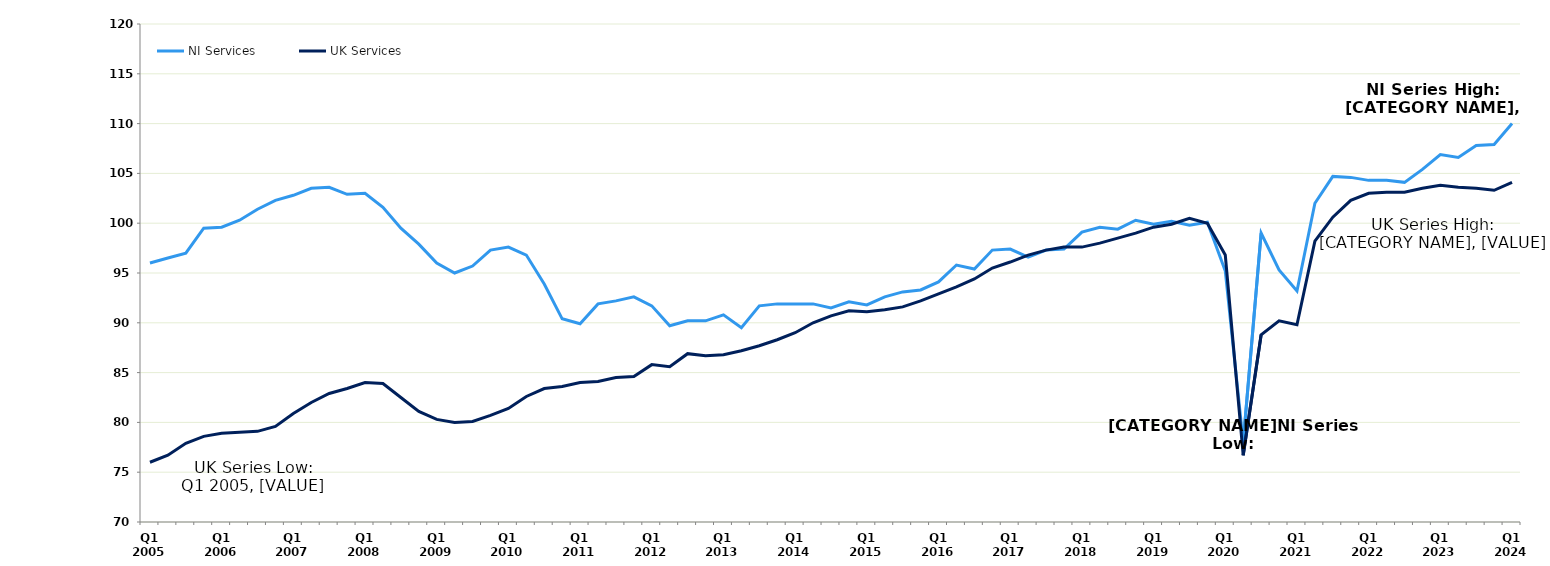
| Category | NI Services | UK Services |
|---|---|---|
| Q1 2005 | 96 | 76 |
|  | 96.5 | 76.7 |
|  | 97 | 77.9 |
|  | 99.5 | 78.6 |
| Q1 2006 | 99.6 | 78.9 |
|  | 100.3 | 79 |
|  | 101.4 | 79.1 |
|  | 102.3 | 79.6 |
| Q1 2007 | 102.8 | 80.9 |
|  | 103.5 | 82 |
|  | 103.6 | 82.9 |
|  | 102.9 | 83.4 |
| Q1 2008 | 103 | 84 |
|  | 101.6 | 83.9 |
|  | 99.5 | 82.5 |
|  | 97.9 | 81.1 |
| Q1 2009 | 96 | 80.3 |
|  | 95 | 80 |
|  | 95.7 | 80.1 |
|  | 97.3 | 80.7 |
| Q1 2010 | 97.6 | 81.4 |
|  | 96.8 | 82.6 |
|  | 93.9 | 83.4 |
|  | 90.4 | 83.6 |
| Q1 2011 | 89.9 | 84 |
|  | 91.9 | 84.1 |
|  | 92.2 | 84.5 |
|  | 92.6 | 84.6 |
| Q1 2012 | 91.7 | 85.8 |
|  | 89.7 | 85.6 |
|  | 90.2 | 86.9 |
|  | 90.2 | 86.7 |
| Q1 2013 | 90.8 | 86.8 |
|  | 89.5 | 87.2 |
|  | 91.7 | 87.7 |
|  | 91.9 | 88.3 |
| Q1 2014 | 91.9 | 89 |
|  | 91.9 | 90 |
|  | 91.5 | 90.7 |
|  | 92.1 | 91.2 |
| Q1 2015 | 91.8 | 91.1 |
|  | 92.6 | 91.3 |
|  | 93.1 | 91.6 |
|  | 93.3 | 92.2 |
| Q1 2016 | 94.1 | 92.9 |
|  | 95.8 | 93.6 |
|  | 95.4 | 94.4 |
|  | 97.3 | 95.5 |
| Q1 2017 | 97.4 | 96.1 |
|  | 96.6 | 96.8 |
|  | 97.3 | 97.3 |
|  | 97.4 | 97.6 |
| Q1 2018 | 99.1 | 97.6 |
|  | 99.6 | 98 |
|  | 99.4 | 98.5 |
|  | 100.3 | 99 |
| Q1 2019 | 99.9 | 99.6 |
|  | 100.2 | 99.9 |
|  | 99.8 | 100.5 |
|  | 100.1 | 100 |
| Q1 2020 | 95.2 | 96.8 |
|  | 78 | 76.7 |
|  | 99 | 88.8 |
|  | 95.3 | 90.2 |
| Q1 2021 | 93.2 | 89.8 |
|  | 102 | 98.2 |
|  | 104.7 | 100.6 |
|  | 104.6 | 102.3 |
| Q1 2022 | 104.3 | 103 |
|  | 104.3 | 103.1 |
|  | 104.1 | 103.1 |
|  | 105.4 | 103.5 |
| Q1 2023 | 106.9 | 103.8 |
|  | 106.6 | 103.6 |
|  | 107.8 | 103.5 |
|  | 107.9 | 103.3 |
| Q1 2024 | 110 | 104.1 |